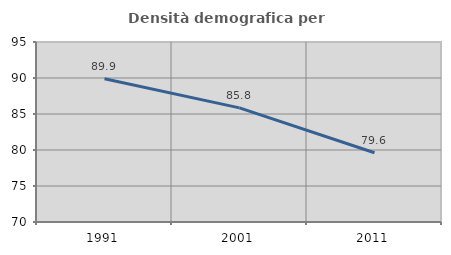
| Category | Densità demografica |
|---|---|
| 1991.0 | 89.898 |
| 2001.0 | 85.848 |
| 2011.0 | 79.613 |